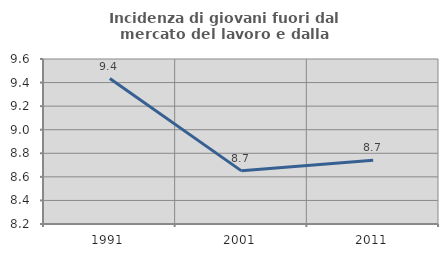
| Category | Incidenza di giovani fuori dal mercato del lavoro e dalla formazione  |
|---|---|
| 1991.0 | 9.434 |
| 2001.0 | 8.651 |
| 2011.0 | 8.74 |